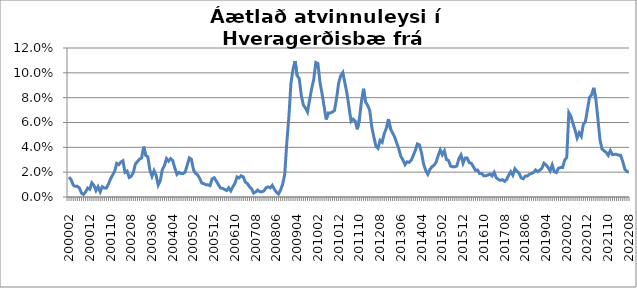
| Category | Series 0 |
|---|---|
| 200002 | 0.016 |
| 200003 | 0.014 |
| 200004 | 0.01 |
| 200005 | 0.009 |
| 200006 | 0.009 |
| 200007 | 0.007 |
| 200008 | 0.003 |
| 200009 | 0.002 |
| 200010 | 0.004 |
| 200011 | 0.007 |
| 200012 | 0.006 |
| 200101 | 0.011 |
| 200102 | 0.009 |
| 200103 | 0.005 |
| 200104 | 0.008 |
| 200105 | 0.004 |
| 200106 | 0.008 |
| 200107 | 0.007 |
| 200108 | 0.007 |
| 200109 | 0.01 |
| 200110 | 0.015 |
| 200111 | 0.018 |
| 200112 | 0.021 |
| 200201 | 0.027 |
| 200202 | 0.026 |
| 200203 | 0.028 |
| 200204 | 0.029 |
| 200205 | 0.02 |
| 200206 | 0.021 |
| 200207 | 0.016 |
| 200208 | 0.017 |
| 200209 | 0.02 |
| 200210 | 0.027 |
| 200211 | 0.029 |
| 200212 | 0.031 |
| 200301 | 0.031 |
| 200302 | 0.041 |
| 200303 | 0.033 |
| 200304 | 0.032 |
| 200305 | 0.022 |
| 200306 | 0.017 |
| 200307 | 0.021 |
| 200308 | 0.017 |
| 200309 | 0.01 |
| 200310 | 0.013 |
| 200311 | 0.022 |
| 200312 | 0.025 |
| 200401 | 0.031 |
| 200402 | 0.029 |
| 200403 | 0.031 |
| 200404 | 0.029 |
| 200405 | 0.023 |
| 200406 | 0.018 |
| 200407 | 0.02 |
| 200408 | 0.019 |
| 200409 | 0.019 |
| 200410 | 0.02 |
| 200411 | 0.026 |
| 200412 | 0.031 |
| 200501 | 0.03 |
| 200502 | 0.022 |
| 200503 | 0.019 |
| 200504 | 0.018 |
| 200505 | 0.015 |
| 200506 | 0.011 |
| 200507 | 0.011 |
| 200508 | 0.01 |
| 200509 | 0.01 |
| 200510 | 0.009 |
| 200511 | 0.015 |
| 200512 | 0.016 |
| 200601 | 0.013 |
| 200602 | 0.01 |
| 200603 | 0.007 |
| 200604 | 0.007 |
| 200605 | 0.006 |
| 200606 | 0.005 |
| 200607 | 0.007 |
| 200608 | 0.005 |
| 200609 | 0.008 |
| 200610 | 0.011 |
| 200611 | 0.016 |
| 200612 | 0.015 |
| 200701 | 0.017 |
| 200702 | 0.016 |
| 200703 | 0.012 |
| 200704 | 0.011 |
| 200705 | 0.008 |
| 200706 | 0.007 |
| 200707 | 0.003 |
| 200708 | 0.004 |
| 200709 | 0.006 |
| 200710 | 0.004 |
| 200711 | 0.004 |
| 200712 | 0.005 |
| 200801 | 0.007 |
| 200802 | 0.008 |
| 200803 | 0.007 |
| 200804 | 0.009 |
| 200805 | 0.006 |
| 200806 | 0.004 |
| 200807 | 0.002 |
| 200808 | 0.006 |
| 200809 | 0.01 |
| 200810 | 0.018 |
| 200811 | 0.044 |
| 200812 | 0.064 |
| 200901 | 0.092 |
| 200902 | 0.103 |
| 200903 | 0.109 |
| 200904 | 0.098 |
| 200905 | 0.095 |
| 200906 | 0.082 |
| 200907 | 0.074 |
| 200908 | 0.072 |
| 200909 | 0.068 |
| 200910 | 0.078 |
| 200911 | 0.087 |
| 200912 | 0.095 |
| 201001 | 0.108 |
| 201002 | 0.107 |
| 201003 | 0.092 |
| 201004 | 0.083 |
| 201005 | 0.073 |
| 201006 | 0.062 |
| 201007 | 0.068 |
| 201008 | 0.068 |
| 201009 | 0.068 |
| 201010 | 0.07 |
| 201011 | 0.079 |
| 201012 | 0.092 |
| 201101 | 0.098 |
| 201102 | 0.1 |
| 201103 | 0.092 |
| 201104 | 0.084 |
| 201105 | 0.072 |
| 201106 | 0.061 |
| 201107 | 0.063 |
| 201108 | 0.061 |
| 201109 | 0.055 |
| 201110 | 0.062 |
| 201111 | 0.077 |
| 201112 | 0.087 |
| 201201 | 0.076 |
| 201202 | 0.074 |
| 201203 | 0.07 |
| 201204 | 0.056 |
| 201205 | 0.048 |
| 201206 | 0.041 |
| 201207 | 0.039 |
| 201208 | 0.046 |
| 201209 | 0.044 |
| 201210 | 0.051 |
| 201211 | 0.055 |
| 201212 | 0.063 |
| 201301 | 0.055 |
| 201302 | 0.052 |
| 201303 | 0.048 |
| 201304 | 0.044 |
| 201305 | 0.039 |
| 201306 | 0.033 |
| 201307 | 0.03 |
| 201308 | 0.026 |
| 201309 | 0.028 |
| 201310 | 0.028 |
| 201311 | 0.029 |
| 201312 | 0.033 |
| 201401 | 0.038 |
| 201402 | 0.043 |
| 201403 | 0.042 |
| 201404 | 0.035 |
| 201405 | 0.026 |
| 201406 | 0.021 |
| 201407 | 0.018 |
| 201408 | 0.022 |
| 201409 | 0.024 |
| 201410 | 0.026 |
| 201411 | 0.028 |
| 201412 | 0.033 |
| 201501 | 0.038 |
| 201502 | 0.034 |
| 201503 | 0.037 |
| 201504 | 0.03 |
| 201505 | 0.029 |
| 201506 | 0.025 |
| 201507 | 0.024 |
| 201508 | 0.024 |
| 201509 | 0.025 |
| 201510 | 0.031 |
| 201511 | 0.034 |
| 201512 | 0.027 |
| 201601 | 0.031 |
| 201602 | 0.031 |
| 201603 | 0.028 |
| 201604 | 0.027 |
| 201605 | 0.024 |
| 201606 | 0.021 |
| 201607 | 0.022 |
| 201608 | 0.019 |
| 201609 | 0.019 |
| 201610 | 0.017 |
| 201611 | 0.017 |
| 201612 | 0.018 |
| 201701 | 0.018 |
| 201702 | 0.017 |
| 201703 | 0.02 |
| 201704 | 0.016 |
| 201705 | 0.014 |
| 201706 | 0.013 |
| 201707 | 0.014 |
| 201708 | 0.013 |
| 201709 | 0.014 |
| 201710 | 0.018 |
| 201711 | 0.02 |
| 201712 | 0.018 |
| 201801 | 0.023 |
| 201802 | 0.021 |
| 201803 | 0.019 |
| 201804 | 0.015 |
| 201805 | 0.015 |
| 201806 | 0.017 |
| 201807 | 0.017 |
| 201808 | 0.018 |
| 201809 | 0.019 |
| 201810 | 0.02 |
| 201811 | 0.022 |
| 201812 | 0.02 |
| 201901 | 0.022 |
| 201902 | 0.023 |
| 201903 | 0.027 |
| 201904 | 0.026 |
| 201905 | 0.024 |
| 201906 | 0.021 |
| 201907 | 0.026 |
| 201908 | 0.02 |
| 201909 | 0.02 |
| 201910 | 0.023 |
| 201911 | 0.024 |
| 201912 | 0.024 |
| 202001 | 0.03 |
| 202002 | 0.032 |
| 202003 | 0.068 |
| 202004 | 0.065 |
| 202005 | 0.059 |
| 202006 | 0.054 |
| 202007 | 0.048 |
| 202008 | 0.052 |
| 202009 | 0.049 |
| 202010 | 0.059 |
| 202011 | 0.061 |
| 202012 | 0.071 |
| 202101 | 0.08 |
| 202102 | 0.082 |
| 202103 | 0.088 |
| 202104 | 0.079 |
| 202105 | 0.063 |
| 202106 | 0.046 |
| 202107 | 0.039 |
| 202108 | 0.037 |
| 202109 | 0.036 |
| 202110 | 0.033 |
| 202111 | 0.037 |
| 202112 | 0.034 |
| 202201 | 0.034 |
| 202202 | 0.034 |
| 202203 | 0.034 |
| 202204 | 0.034 |
| 202205 | 0.029 |
| 202206 | 0.022 |
| 202207 | 0.021 |
| 202208 | 0.02 |